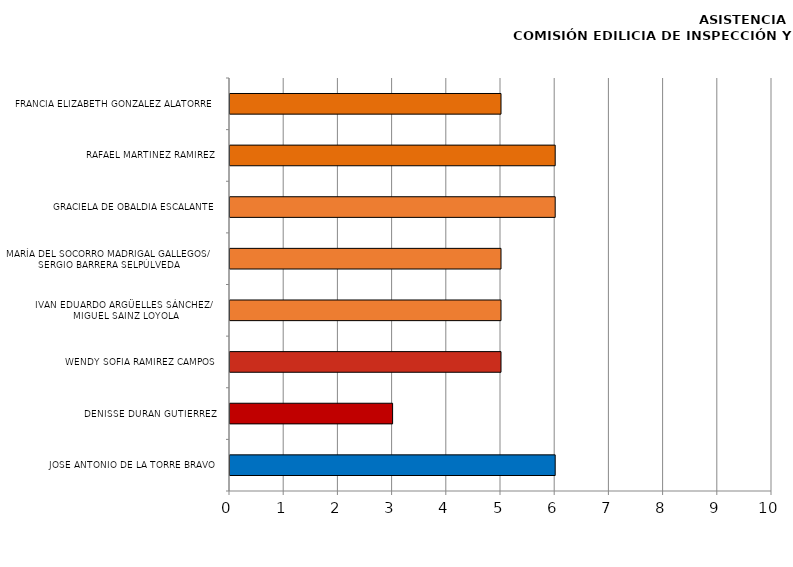
| Category | Series 0 |
|---|---|
| JOSÉ ANTONIO DE LA TORRE BRAVO | 6 |
| DENISSE DURÁN GUTIÉRREZ | 3 |
| WENDY SOFÍA RAMÍREZ CAMPOS | 5 |
| IVAN EDUARDO ARGÜELLES SÁNCHEZ/
MIGUEL SAINZ LOYOLA | 5 |
| MARÍA DEL SOCORRO MADRIGAL GALLEGOS/
SERGIO BARRERA SELPÚLVEDA | 5 |
| GRACIELA DE OBALDÍA ESCALANTE | 6 |
| RAFAEL MARTÍNEZ RAMÍREZ | 6 |
| FRANCIA ELIZABETH GONZÁLEZ ALATORRE | 5 |